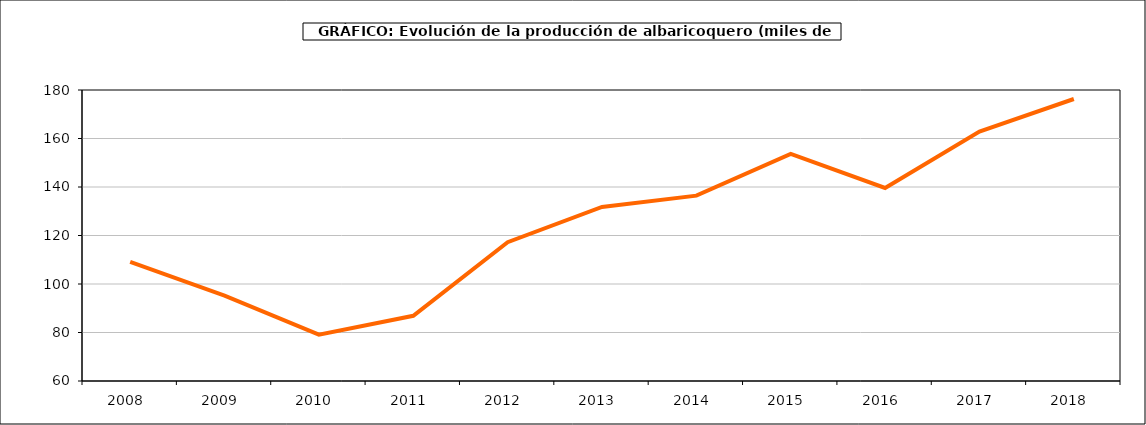
| Category | producción albaricoquero |
|---|---|
| 2008.0 | 109.108 |
| 2009.0 | 95.221 |
| 2010.0 | 79.101 |
| 2011.0 | 86.88 |
| 2012.0 | 117.24 |
| 2013.0 | 131.776 |
| 2014.0 | 136.446 |
| 2015.0 | 153.667 |
| 2016.0 | 139.605 |
| 2017.0 | 162.872 |
| 2018.0 | 176.289 |